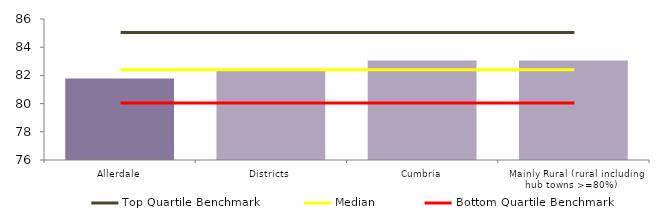
| Category | Block Data |
|---|---|
| Allerdale | 81.775 |
| Districts | 82.352 |
| Cumbria | 83.051 |
|  Mainly Rural (rural including hub towns >=80%)   | 83.05 |